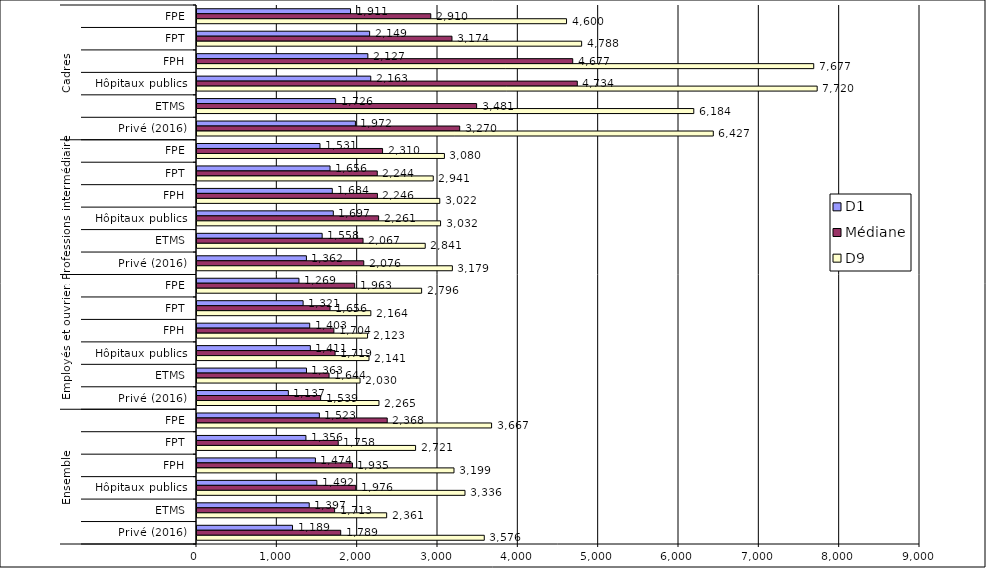
| Category | D1 | Médiane | D9 |
|---|---|---|---|
| 0 | 1911 | 2910 | 4600 |
| 1 | 2149 | 3174 | 4788 |
| 2 | 2127 | 4677 | 7677 |
| 3 | 2163 | 4734 | 7720 |
| 4 | 1726 | 3481 | 6184 |
| 5 | 1972 | 3270 | 6427 |
| 6 | 1531 | 2310 | 3080 |
| 7 | 1656 | 2244 | 2941 |
| 8 | 1684 | 2246 | 3022 |
| 9 | 1697 | 2261 | 3032 |
| 10 | 1558 | 2067 | 2841 |
| 11 | 1362 | 2076 | 3179 |
| 12 | 1269 | 1963 | 2796 |
| 13 | 1321 | 1656 | 2164 |
| 14 | 1403 | 1704 | 2123 |
| 15 | 1411 | 1719 | 2141 |
| 16 | 1363 | 1644 | 2030 |
| 17 | 1137 | 1539 | 2265 |
| 18 | 1523 | 2368 | 3667 |
| 19 | 1356 | 1758 | 2721 |
| 20 | 1474 | 1935 | 3199 |
| 21 | 1492 | 1976 | 3336 |
| 22 | 1397 | 1713 | 2361 |
| 23 | 1189 | 1789 | 3576 |